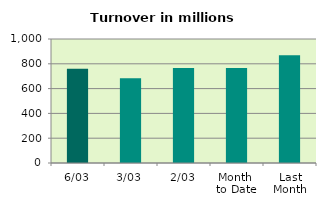
| Category | Series 0 |
|---|---|
| 6/03 | 760.573 |
| 3/03 | 682.943 |
| 2/03 | 765.784 |
| Month 
to Date | 765.295 |
| Last
Month | 868.35 |